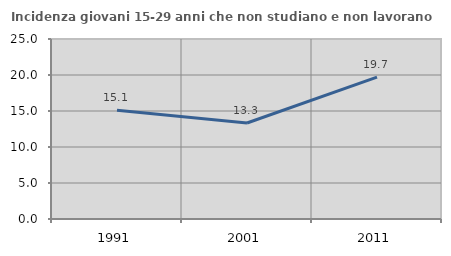
| Category | Incidenza giovani 15-29 anni che non studiano e non lavorano  |
|---|---|
| 1991.0 | 15.093 |
| 2001.0 | 13.333 |
| 2011.0 | 19.697 |